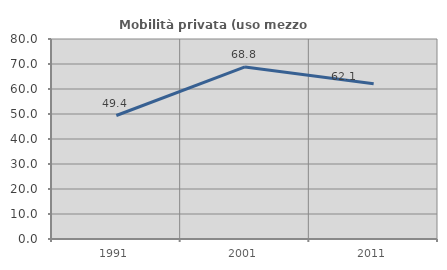
| Category | Mobilità privata (uso mezzo privato) |
|---|---|
| 1991.0 | 49.398 |
| 2001.0 | 68.817 |
| 2011.0 | 62.128 |